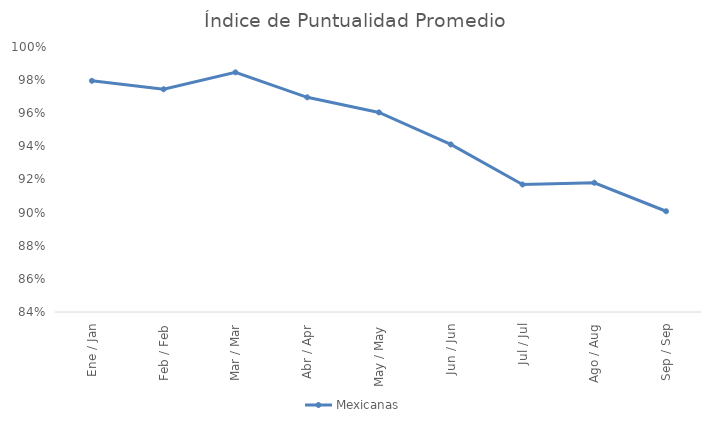
| Category | Mexicanas |
|---|---|
| Ene / Jan | 0.98 |
| Feb / Feb | 0.974 |
| Mar / Mar | 0.985 |
| Abr / Apr | 0.97 |
| May / May | 0.961 |
| Jun / Jun | 0.941 |
| Jul / Jul | 0.917 |
| Ago / Aug | 0.918 |
| Sep / Sep | 0.901 |